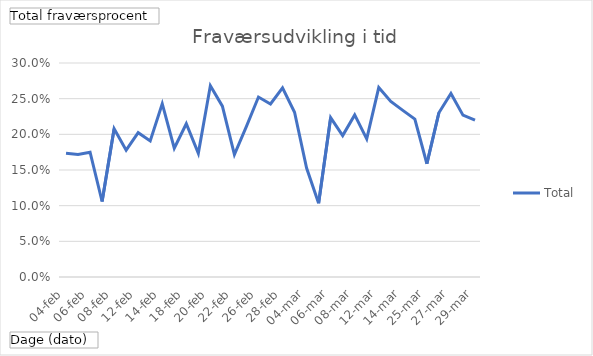
| Category | Total |
|---|---|
| 04-feb | 0.173 |
| 05-feb | 0.172 |
| 06-feb | 0.175 |
| 07-feb | 0.106 |
| 08-feb | 0.208 |
| 11-feb | 0.178 |
| 12-feb | 0.202 |
| 13-feb | 0.191 |
| 14-feb | 0.243 |
| 15-feb | 0.181 |
| 18-feb | 0.215 |
| 19-feb | 0.173 |
| 20-feb | 0.268 |
| 21-feb | 0.239 |
| 22-feb | 0.172 |
| 25-feb | 0.211 |
| 26-feb | 0.252 |
| 27-feb | 0.243 |
| 28-feb | 0.265 |
| 01-mar | 0.231 |
| 04-mar | 0.153 |
| 05-mar | 0.103 |
| 06-mar | 0.223 |
| 07-mar | 0.198 |
| 08-mar | 0.227 |
| 11-mar | 0.194 |
| 12-mar | 0.266 |
| 13-mar | 0.246 |
| 14-mar | 0.234 |
| 15-mar | 0.221 |
| 25-mar | 0.159 |
| 26-mar | 0.23 |
| 27-mar | 0.257 |
| 28-mar | 0.227 |
| 29-mar | 0.22 |